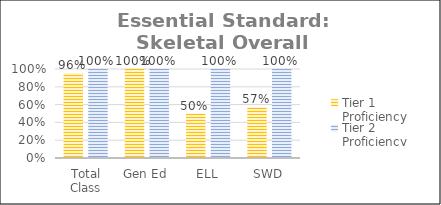
| Category | Tier 1 Proficiency | Tier 2 Proficiency |
|---|---|---|
| Total Class | 0.955 | 1 |
| Gen Ed | 1 | 1 |
| ELL | 0.5 | 1 |
| SWD | 0.571 | 1 |